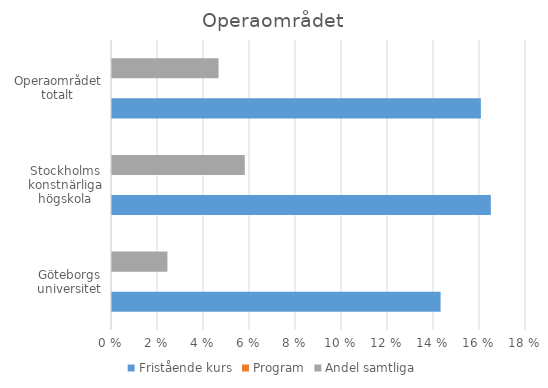
| Category | Fristående kurs | Program | Andel samtliga |
|---|---|---|---|
| Göteborgs universitet | 0.143 | 0 | 0.024 |
| Stockholms konstnärliga högskola | 0.165 | 0 | 0.058 |
| Operaområdet totalt | 0.16 | 0 | 0.046 |